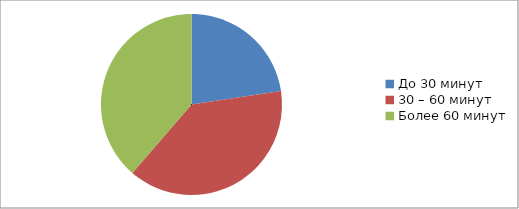
| Category | Series 0 |
|---|---|
| До 30 минут | 360 |
| 30 – 60 минут | 616 |
| Более 60 минут | 615 |